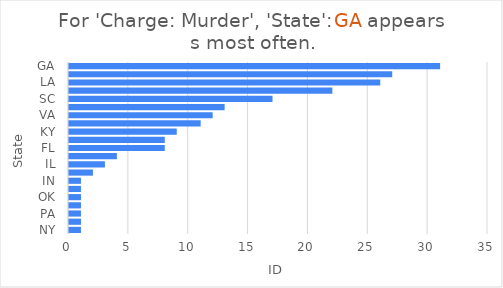
| Category | Total |
|---|---|
| GA | 31 |
| AL | 27 |
| LA | 26 |
| MS | 22 |
| SC | 17 |
| TX | 13 |
| VA | 12 |
| TN | 11 |
| KY | 9 |
| AR | 8 |
| FL | 8 |
| MO | 4 |
| IL | 3 |
| KS | 2 |
| IN | 1 |
| WV | 1 |
| OK | 1 |
| AK | 1 |
| PA | 1 |
| OH | 1 |
| NY | 1 |